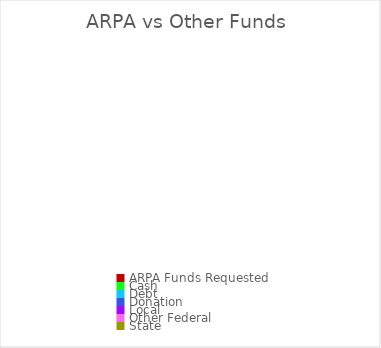
| Category | Series 0 |
|---|---|
| ARPA Funds Requested | 0 |
| Cash | 0 |
| Debt | 0 |
| Donation | 0 |
| Local | 0 |
| Other Federal | 0 |
| State | 0 |